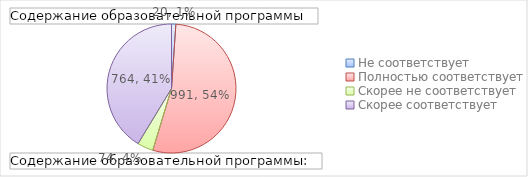
| Category | Итог |
|---|---|
| Не соответствует | 20 |
| Полностью соответствует | 991 |
| Скорее не соответствует | 74 |
| Скорее соответствует | 764 |